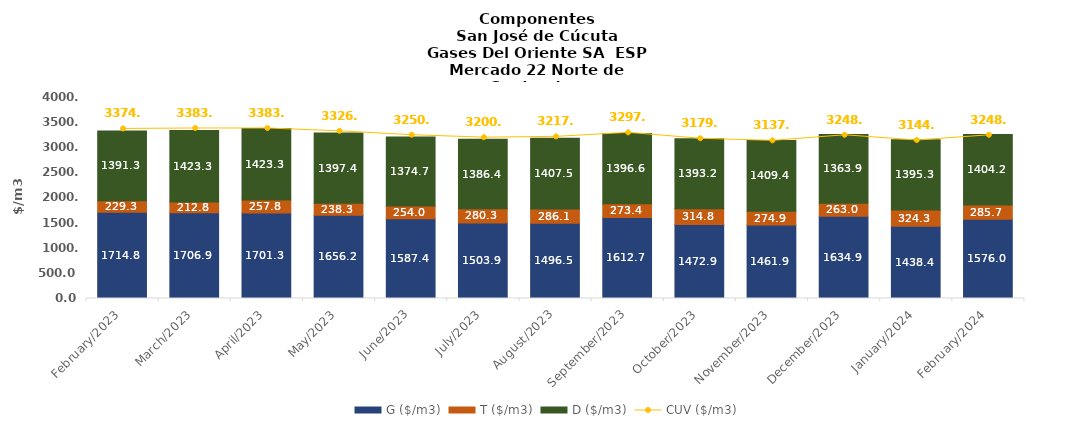
| Category | G ($/m3) | T ($/m3) | D ($/m3) |
|---|---|---|---|
| 2023-02-01 | 1714.78 | 229.32 | 1391.26 |
| 2023-03-01 | 1706.94 | 212.77 | 1423.33 |
| 2023-04-01 | 1701.33 | 257.81 | 1423.3 |
| 2023-05-01 | 1656.2 | 238.29 | 1397.37 |
| 2023-06-01 | 1587.41 | 254 | 1374.66 |
| 2023-07-01 | 1503.89 | 280.27 | 1386.35 |
| 2023-08-01 | 1496.47 | 286.1 | 1407.49 |
| 2023-09-01 | 1612.68 | 273.44 | 1396.57 |
| 2023-10-01 | 1472.87 | 314.83 | 1393.18 |
| 2023-11-01 | 1461.93 | 274.94 | 1409.38 |
| 2023-12-01 | 1634.91 | 262.98 | 1363.86 |
| 2024-01-01 | 1438.39 | 324.32 | 1395.26 |
| 2024-02-01 | 1576.01 | 285.69 | 1404.22 |